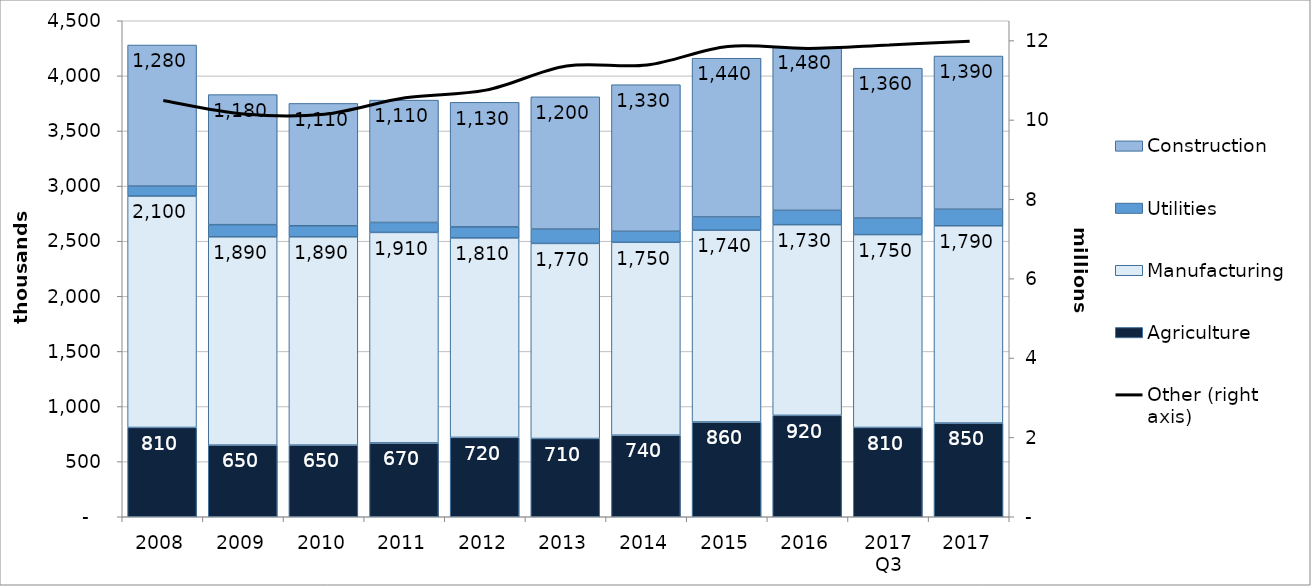
| Category |  Agriculture  |  Manufacturing  |  Utilities  |  Construction  |
|---|---|---|---|---|
| 2008 | 810 | 2100 | 90 | 1280 |
| 2009 | 650 | 1890 | 110 | 1180 |
| 2010 | 650 | 1890 | 100 | 1110 |
| 2011 | 670 | 1910 | 90 | 1110 |
| 2012 | 720 | 1810 | 100 | 1130 |
| 2013 | 710 | 1770 | 130 | 1200 |
| 2014 | 740 | 1750 | 100 | 1330 |
| 2015 | 860 | 1740 | 120 | 1440 |
| 2016 | 920 | 1730 | 130 | 1480 |
| 2017 Q3 | 810 | 1750 | 150 | 1360 |
| 2017 | 850 | 1790 | 150 | 1390 |